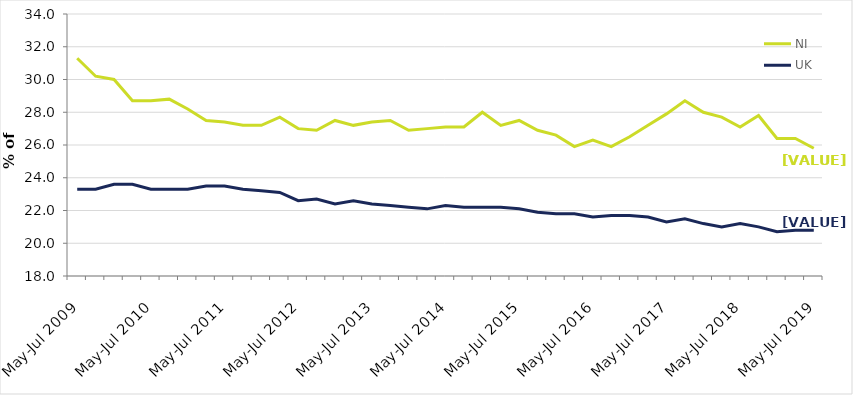
| Category | NI | UK |
|---|---|---|
| May-Jul 2009 | 31.3 | 23.3 |
| Aug-Oct 2009 | 30.2 | 23.3 |
| Nov-Jan 2010 | 30 | 23.6 |
| Feb-Apr 2010 | 28.7 | 23.6 |
| May-Jul 2010 | 28.7 | 23.3 |
| Aug-Oct 2010 | 28.8 | 23.3 |
| Nov-Jan 2011 | 28.2 | 23.3 |
| Feb-Apr 2011 | 27.5 | 23.5 |
| May-Jul 2011 | 27.4 | 23.5 |
| Aug-Oct 2011 | 27.2 | 23.3 |
| Nov-Jan 2012 | 27.2 | 23.2 |
| Feb-Apr 2012 | 27.7 | 23.1 |
| May-Jul 2012 | 27 | 22.6 |
| Aug-Oct 2012 | 26.9 | 22.7 |
| Nov-Jan 2013 | 27.5 | 22.4 |
| Feb-Apr 2013 | 27.2 | 22.6 |
| May-Jul 2013 | 27.4 | 22.4 |
| Aug-Oct 2013 | 27.5 | 22.3 |
| Nov-Jan 2014 | 26.9 | 22.2 |
| Feb-Apr 2014 | 27 | 22.1 |
| May-Jul 2014 | 27.1 | 22.3 |
| Aug-Oct 2014 | 27.1 | 22.2 |
| Nov-Jan 2015 | 28 | 22.2 |
| Feb-Apr 2015 | 27.2 | 22.2 |
| May-Jul 2015 | 27.5 | 22.1 |
| Aug-Oct 2015 | 26.9 | 21.9 |
| Nov-Jan 2016 | 26.6 | 21.8 |
| Feb-Apr 2016 | 25.9 | 21.8 |
| May-Jul 2016 | 26.3 | 21.6 |
| Aug-Oct 2016 | 25.9 | 21.7 |
| Nov-Jan 2017 | 26.5 | 21.7 |
| Feb-Apr 2017 | 27.2 | 21.6 |
| May-Jul 2017 | 27.9 | 21.3 |
| Aug-Oct 2017 | 28.7 | 21.5 |
| Nov-Jan 2018 | 28 | 21.2 |
| Feb-Apr 2018 | 27.7 | 21 |
| May-Jul 2018 | 27.1 | 21.2 |
| Aug-Oct 2018 | 27.8 | 21 |
| Nov-Jan 2019 | 26.4 | 20.7 |
| Feb-Apr 2019 | 26.4 | 20.8 |
| May-Jul 2019 | 25.8 | 20.8 |